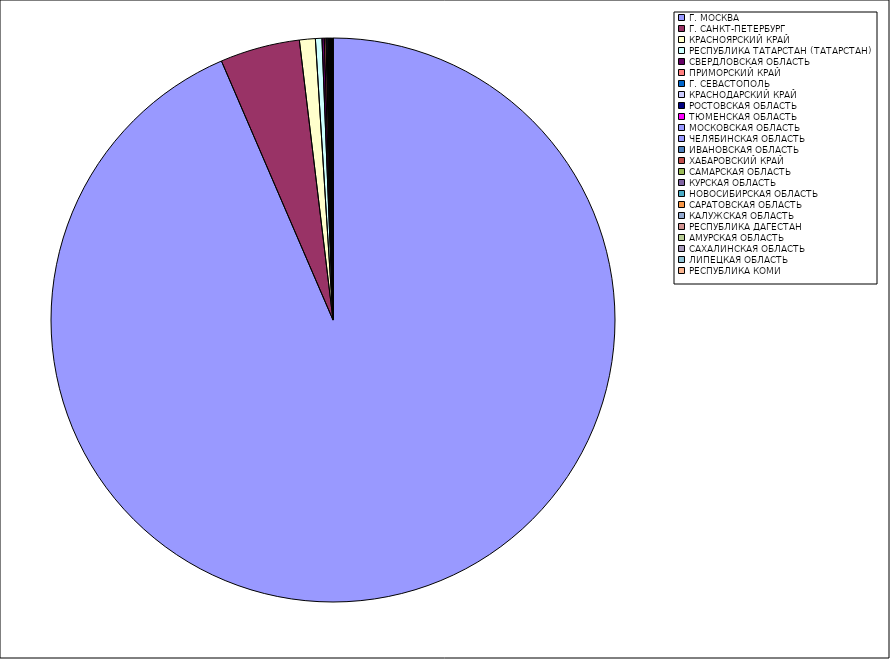
| Category | Оборот |
|---|---|
| Г. МОСКВА | 93.471 |
| Г. САНКТ-ПЕТЕРБУРГ | 4.566 |
| КРАСНОЯРСКИЙ КРАЙ | 0.908 |
| РЕСПУБЛИКА ТАТАРСТАН (ТАТАРСТАН) | 0.373 |
| СВЕРДЛОВСКАЯ ОБЛАСТЬ | 0.131 |
| ПРИМОРСКИЙ КРАЙ | 0.093 |
| Г. СЕВАСТОПОЛЬ | 0.06 |
| КРАСНОДАРСКИЙ КРАЙ | 0.055 |
| РОСТОВСКАЯ ОБЛАСТЬ | 0.048 |
| ТЮМЕНСКАЯ ОБЛАСТЬ | 0.04 |
| МОСКОВСКАЯ ОБЛАСТЬ | 0.036 |
| ЧЕЛЯБИНСКАЯ ОБЛАСТЬ | 0.03 |
| ИВАНОВСКАЯ ОБЛАСТЬ | 0.021 |
| ХАБАРОВСКИЙ КРАЙ | 0.017 |
| САМАРСКАЯ ОБЛАСТЬ | 0.016 |
| КУРСКАЯ ОБЛАСТЬ | 0.013 |
| НОВОСИБИРСКАЯ ОБЛАСТЬ | 0.011 |
| САРАТОВСКАЯ ОБЛАСТЬ | 0.01 |
| КАЛУЖСКАЯ ОБЛАСТЬ | 0.01 |
| РЕСПУБЛИКА ДАГЕСТАН | 0.008 |
| АМУРСКАЯ ОБЛАСТЬ | 0.007 |
| САХАЛИНСКАЯ ОБЛАСТЬ | 0.007 |
| ЛИПЕЦКАЯ ОБЛАСТЬ | 0.006 |
| РЕСПУБЛИКА КОМИ | 0.006 |